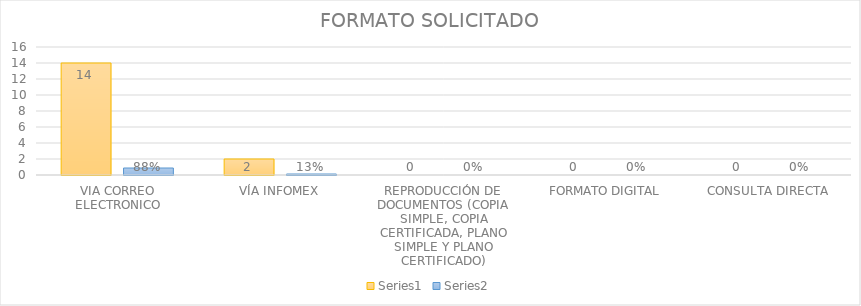
| Category | Series 3 | Series 4 |
|---|---|---|
| VIA CORREO ELECTRONICO | 14 | 0.875 |
| VÍA INFOMEX | 2 | 0.125 |
| REPRODUCCIÓN DE DOCUMENTOS (COPIA SIMPLE, COPIA CERTIFICADA, PLANO SIMPLE Y PLANO CERTIFICADO) | 0 | 0 |
| FORMATO DIGITAL | 0 | 0 |
| CONSULTA DIRECTA | 0 | 0 |